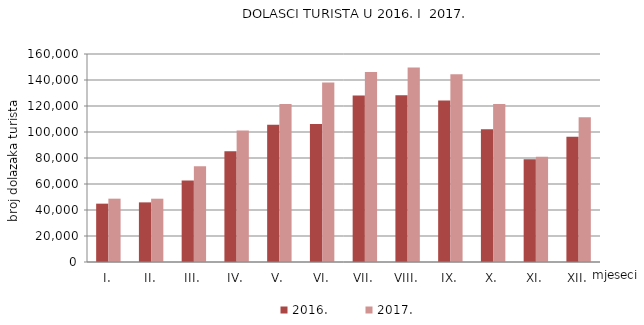
| Category | 2016. | 2017. |
|---|---|---|
| I. | 44876 | 48720 |
| II. | 45866 | 48696 |
| III. | 62711 | 73742 |
| IV. | 85228 | 101117 |
| V. | 105578 | 121570 |
| VI. | 106207 | 138169 |
| VII. | 128136 | 146192 |
| VIII. | 128262 | 149702 |
| IX. | 124198 | 144432 |
| X. | 102122 | 121462 |
| XI. | 78982 | 81032 |
| XII. | 96434 | 111253 |